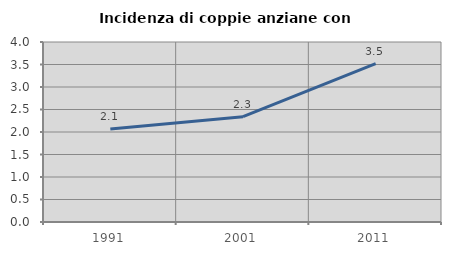
| Category | Incidenza di coppie anziane con figli |
|---|---|
| 1991.0 | 2.068 |
| 2001.0 | 2.339 |
| 2011.0 | 3.522 |